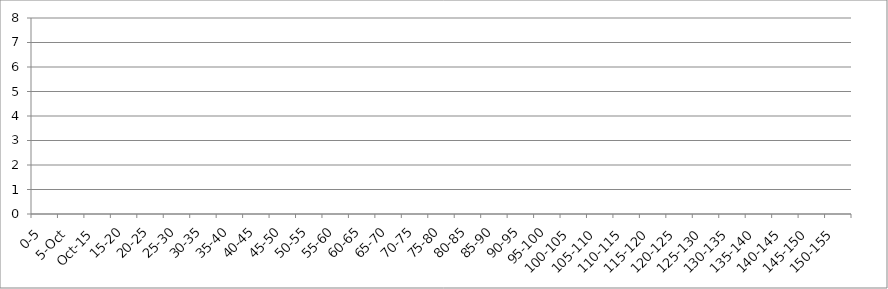
| Category | 119875 | 146067 | 241240 |
|---|---|---|---|
| 0-5 | 0 | 0 | 0 |
| 5-Oct | 0 | 0 | 0 |
| Oct-15 | 0 | 0 | 0 |
| 15-20 | 0 | 0 | 0 |
| 20-25 | 0 | 0 | 0 |
| 25-30 | 0 | 0 | 0 |
| 30-35 | 0 | 0 | 0 |
| 35-40 | 0 | 0 | 0 |
| 40-45 | 0 | 0 | 0 |
| 45-50 | 0 | 0 | 0 |
| 50-55 | 0 | 0 | 0 |
| 55-60 | 0 | 0 | 0 |
| 60-65 | 0 | 0 | 0 |
| 65-70 | 0 | 0 | 0 |
| 70-75 | 0 | 0 | 0 |
| 75-80 | 0 | 0 | 0 |
| 80-85 | 0 | 0 | 0 |
| 85-90 | 0 | 0 | 0 |
| 90-95 | 0 | 0 | 0 |
| 95-100 | 0 | 0 | 0 |
| 100-105 | 0 | 0 | 0 |
| 105-110 | 0 | 0 | 0 |
| 110-115 | 0 | 0 | 0 |
| 115-120 | 0 | 0 | 0 |
| 120-125 | 0 | 0 | 0 |
| 125-130 | 0 | 0 | 0 |
| 130-135 | 0 | 0 | 0 |
| 135-140 | 0 | 0 | 0 |
| 140-145 | 0 | 0 | 0 |
| 145-150 | 0 | 0 | 0 |
| 150-155 | 0 | 0 | 0 |